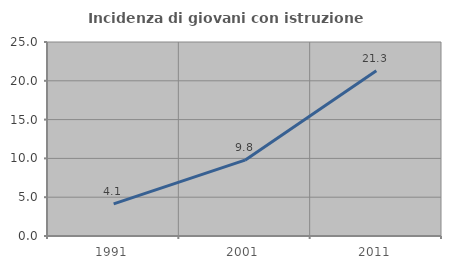
| Category | Incidenza di giovani con istruzione universitaria |
|---|---|
| 1991.0 | 4.138 |
| 2001.0 | 9.775 |
| 2011.0 | 21.282 |